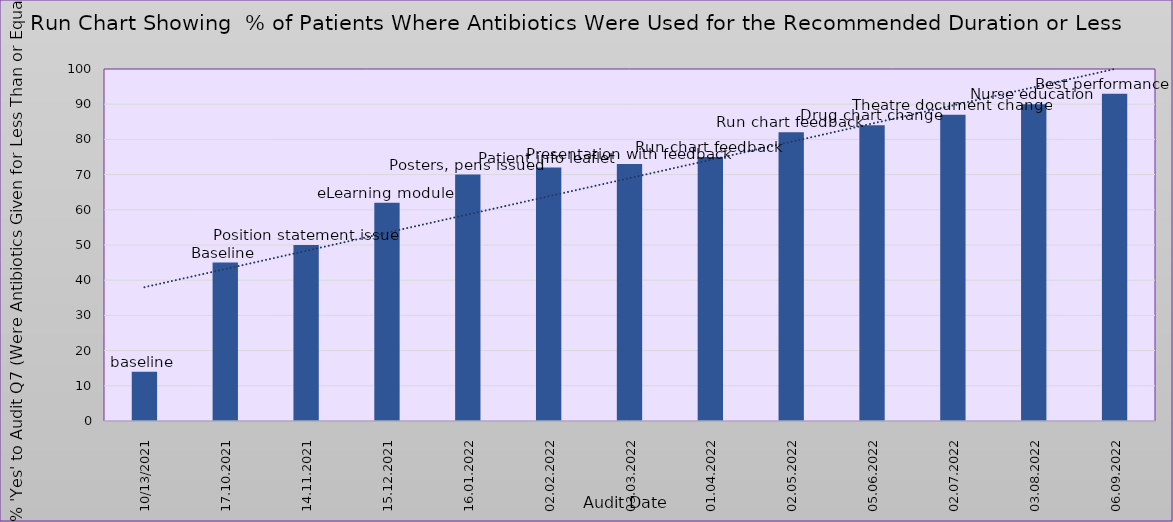
| Category | % 'Yes' Q7 |
|---|---|
| 13/10/2021 | 14 |
| 17.10.2021 | 45 |
| 14.11.2021 | 50 |
| 15.12.2021 | 62 |
| 16.01.2022 | 70 |
| 02.02.2022 | 72 |
| 03.03.2022 | 73 |
| 01.04.2022 | 75 |
| 02.05.2022 | 82 |
| 05.06.2022 | 84 |
| 02.07.2022 | 87 |
| 03.08.2022 | 90 |
| 06.09.2022 | 93 |